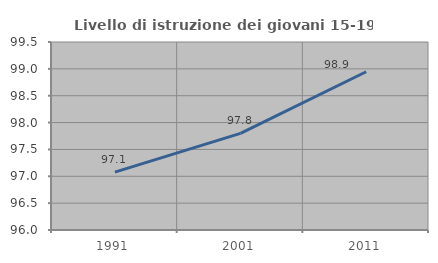
| Category | Livello di istruzione dei giovani 15-19 anni |
|---|---|
| 1991.0 | 97.078 |
| 2001.0 | 97.799 |
| 2011.0 | 98.946 |